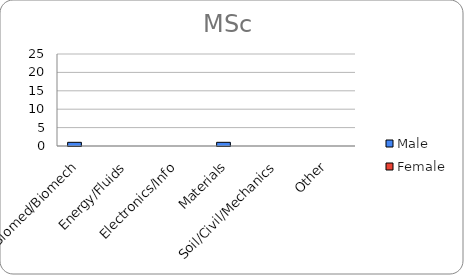
| Category | Male | Female |
|---|---|---|
| Biomed/Biomech | 1 | 0 |
| Energy/Fluids | 0 | 0 |
| Electronics/Info | 0 | 0 |
| Materials | 1 | 0 |
| Soil/Civil/Mechanics | 0 | 0 |
| Other | 0 | 0 |